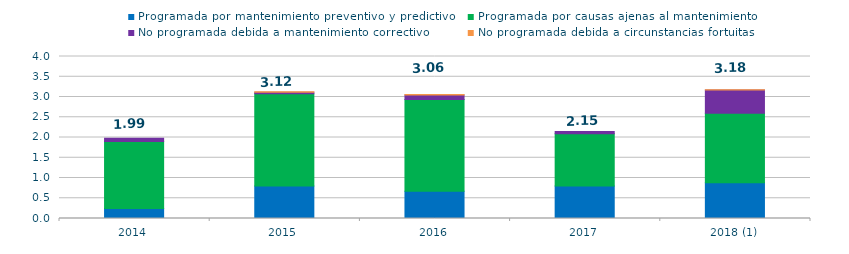
| Category | Programada por mantenimiento preventivo y predictivo | Programada por causas ajenas al mantenimiento  | No programada debida a mantenimiento correctivo  | No programada debida a circunstancias fortuitas  |
|---|---|---|---|---|
| 2014 | 0.25 | 1.65 | 0.08 | 0 |
| 2015 | 0.8 | 2.28 | 0.04 | 0.01 |
| 2016 | 0.67 | 2.27 | 0.11 | 0.01 |
| 2017 | 0.8 | 1.29 | 0.06 | 0 |
| 2018 (1) | 0.88 | 1.72 | 0.57 | 0.01 |